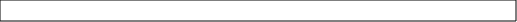
| Category | SUPERFICIE ha |
|---|---|
| 0 | 30.28 |
| 1 | 29.015 |
| 2 | 28.162 |
| 3 | 25.128 |
| 4 | 24.503 |
| 5 | 24.373 |
| 6 | 21.873 |
| 7 | 20.608 |
| 8 | 19.191 |
| 9 | 17.638 |
| 10 | 12.944 |
| 11 | 12.774 |
| 12 | 12.676 |
| 13 | 12.212 |
| 14 | 11.399 |
| 15 | 7.747 |
| 16 | 7.566 |
| 17 | 7.204 |
| 18 | 4.041 |
| 19 | 3.884 |
| 20 | 1.411 |